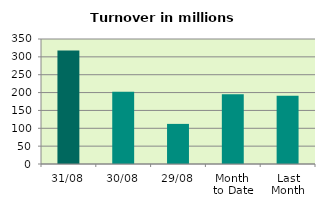
| Category | Series 0 |
|---|---|
| 31/08 | 318.119 |
| 30/08 | 202.035 |
| 29/08 | 112.282 |
| Month 
to Date | 195.366 |
| Last
Month | 191.038 |